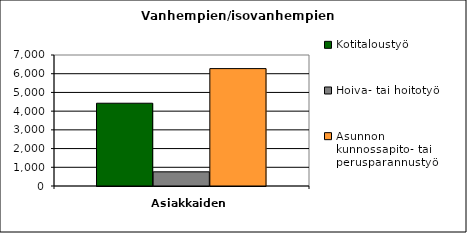
| Category | Kotitaloustyö | Hoiva- tai hoitotyö | Asunnon kunnossapito- tai perusparannustyö |
|---|---|---|---|
| 0 | 4423 | 757 | 6273 |